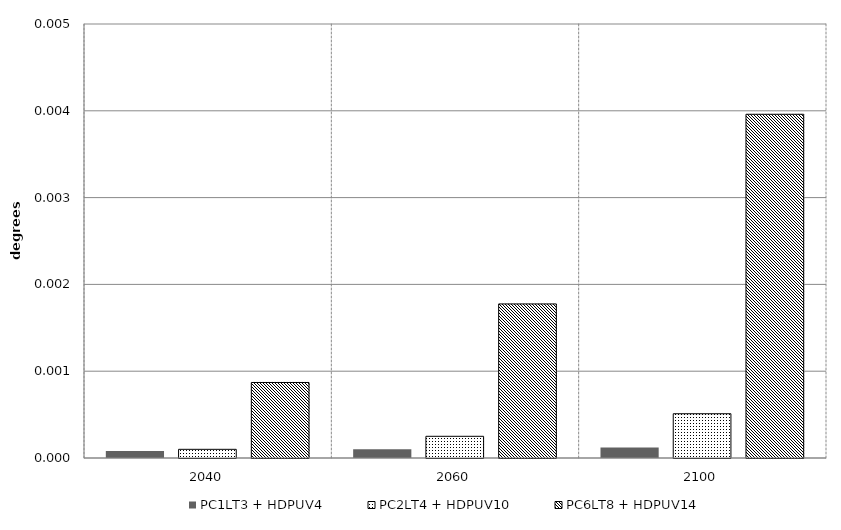
| Category | PC1LT3 + HDPUV4 | PC2LT4 + HDPUV10 | PC6LT8 + HDPUV14 | Alt 5 | Alt 6 | Alt 7 | Alt 8 | Alt 10 |
|---|---|---|---|---|---|---|---|---|
| 2040.0 | 0 | 0 | 0.001 |  |  |  |  |  |
| 2060.0 | 0 | 0 | 0.002 |  |  |  |  |  |
| 2100.0 | 0 | 0.001 | 0.004 |  |  |  |  |  |